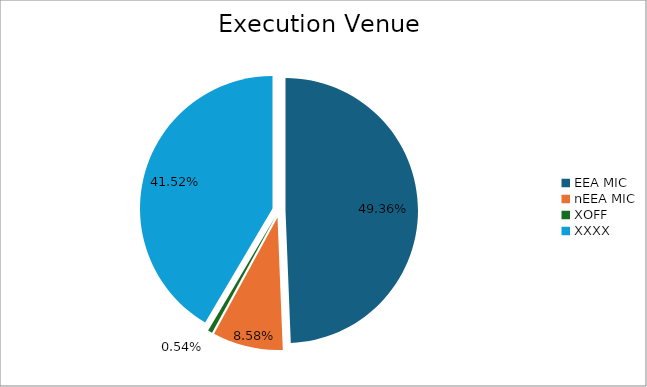
| Category | Series 0 |
|---|---|
| EEA MIC | 7078986.999 |
| nEEA MIC | 1230799.517 |
| XOFF | 77348.637 |
| XXXX | 5953708.408 |